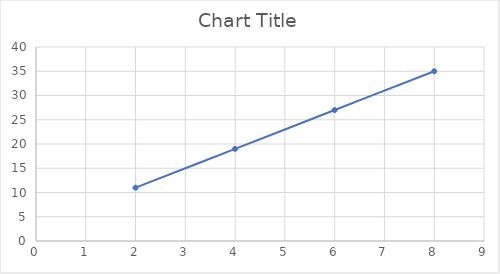
| Category | Series 0 |
|---|---|
| 2.0 | 11 |
| 4.0 | 19 |
| 6.0 | 27 |
| 8.0 | 35 |